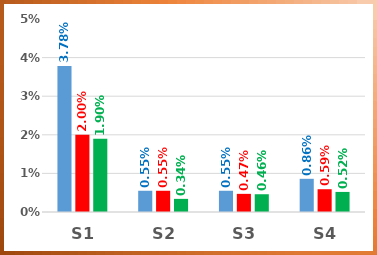
| Category | MAX | Rang2 | Rang3 |
|---|---|---|---|
| S1 | 0.038 | 0.02 | 0.019 |
| S2 | 0.006 | 0.006 | 0.003 |
| S3 | 0.006 | 0.005 | 0.005 |
| S4 | 0.009 | 0.006 | 0.005 |